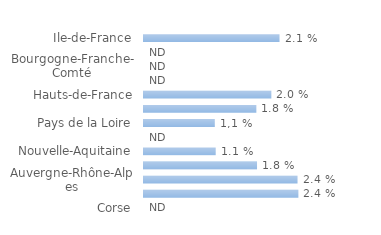
| Category | Series 0 |
|---|---|
| Ile-de-France | 0.021 |
| Centre-Val de Loire | 0 |
| Bourgogne-Franche-Comté | 0 |
| Normandie | 0 |
| Hauts-de-France | 0.02 |
| Grand Est | 0.018 |
| Pays de la Loire | 0.011 |
| Bretagne | 0 |
| Nouvelle-Aquitaine | 0.011 |
| Occitanie | 0.018 |
| Auvergne-Rhône-Alpes | 0.024 |
| Provence-Alpes-Côte d'Azur | 0.024 |
| Corse | 0 |